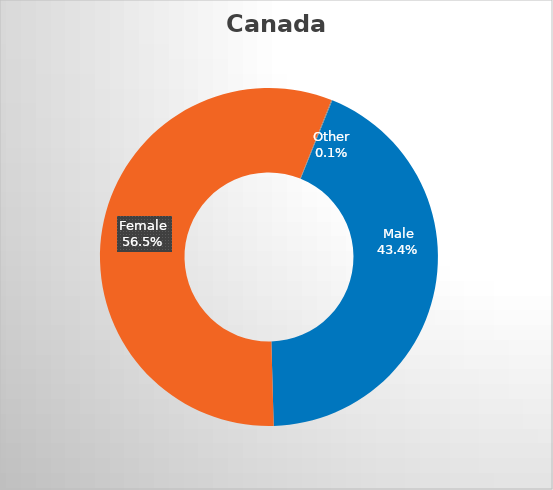
| Category | Canada |
|---|---|
| Male | 0.434 |
| Female | 0.565 |
| Other | 0.001 |